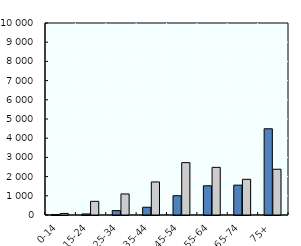
| Category | Mental and behavioural disorders | Suicide |
|---|---|---|
| 0-14 | 19 | 80 |
| 15-24 | 55 | 712 |
| 25-34 | 229 | 1097 |
| 35-44 | 403 | 1722 |
| 45-54 | 1005 | 2727 |
| 55-64 | 1522 | 2482 |
| 65-74 | 1555 | 1859 |
| 75+ | 4491 | 2383 |